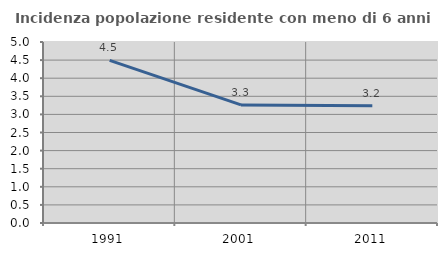
| Category | Incidenza popolazione residente con meno di 6 anni |
|---|---|
| 1991.0 | 4.491 |
| 2001.0 | 3.263 |
| 2011.0 | 3.239 |